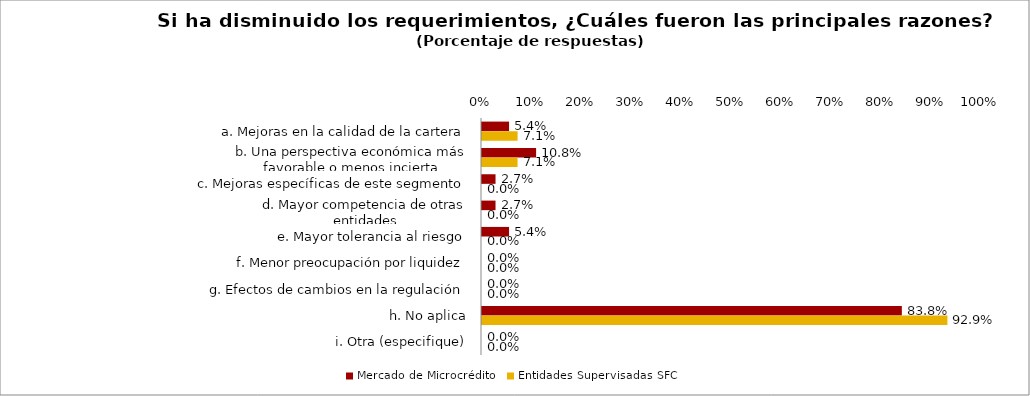
| Category | Mercado de Microcrédito | Entidades Supervisadas SFC |
|---|---|---|
| a. Mejoras en la calidad de la cartera | 0.054 | 0.071 |
| b. Una perspectiva económica más favorable o menos incierta | 0.108 | 0.071 |
| c. Mejoras específicas de este segmento | 0.027 | 0 |
| d. Mayor competencia de otras entidades | 0.027 | 0 |
| e. Mayor tolerancia al riesgo | 0.054 | 0 |
| f. Menor preocupación por liquidez | 0 | 0 |
| g. Efectos de cambios en la regulación | 0 | 0 |
| h. No aplica | 0.838 | 0.929 |
| i. Otra (especifique) | 0 | 0 |